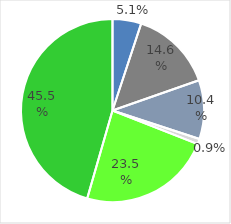
| Category | Series 0 |
|---|---|
| Kernenergie | 0.051 |
| Kohle | 0.146 |
| Erdgas | 0.104 |
| Sonstige fossile Energieträger | 0.009 |
| Sonstige erneuerbare Energien | 0.235 |
| Erneuerbare Energien, _x000d_gefördert nach dem EEG | 0.455 |